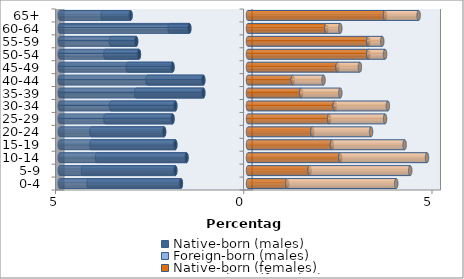
| Category | Native-born (males) | Foreign-born (males) | Native-born (females) | Foreign-born (females) |
|---|---|---|---|---|
| 0-4 | -1.783 | -2.452 | 1.04 | 2.897 |
| 5-9 | -1.932 | -2.452 | 1.634 | 2.675 |
| 10-14 | -1.634 | -2.377 | 2.452 | 2.303 |
| 15-19 | -1.932 | -2.229 | 2.229 | 1.932 |
| 20-24 | -2.229 | -1.932 | 1.709 | 1.56 |
| 25-29 | -2.006 | -1.783 | 2.155 | 1.486 |
| 30-34 | -1.932 | -1.709 | 2.303 | 1.412 |
| 35-39 | -1.189 | -1.783 | 1.412 | 1.04 |
| 40-44 | -1.189 | -1.486 | 1.189 | 0.817 |
| 45-49 | -2.006 | -1.189 | 2.377 | 0.594 |
| 50-54 | -2.897 | -0.892 | 3.195 | 0.446 |
| 55-59 | -2.972 | -0.669 | 3.195 | 0.371 |
| 60-64 | -1.56 | -0.52 | 2.08 | 0.371 |
| 65+ | -3.12 | -0.743 | 3.64 | 0.892 |